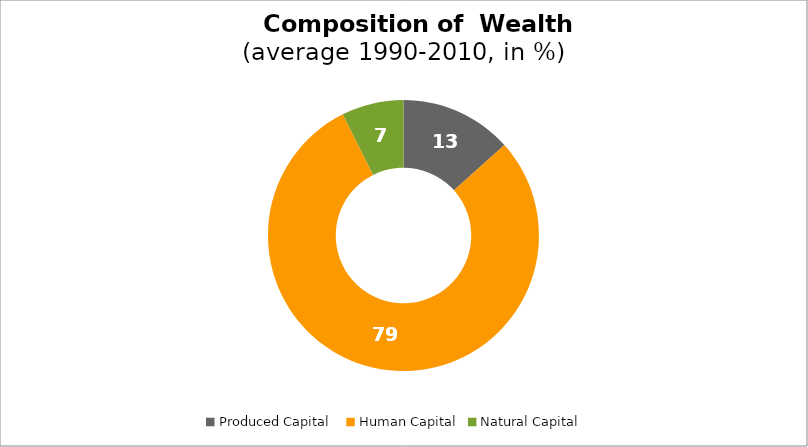
| Category | Series 0 |
|---|---|
| Produced Capital  | 13.376 |
| Human Capital | 79.229 |
| Natural Capital | 7.395 |